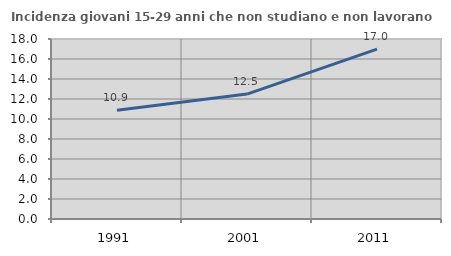
| Category | Incidenza giovani 15-29 anni che non studiano e non lavorano  |
|---|---|
| 1991.0 | 10.883 |
| 2001.0 | 12.49 |
| 2011.0 | 16.983 |